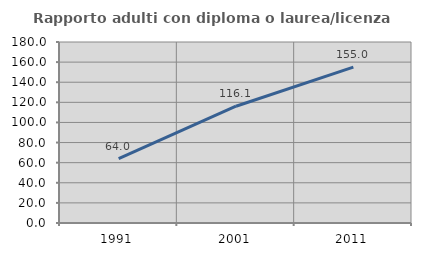
| Category | Rapporto adulti con diploma o laurea/licenza media  |
|---|---|
| 1991.0 | 64 |
| 2001.0 | 116.12 |
| 2011.0 | 154.958 |